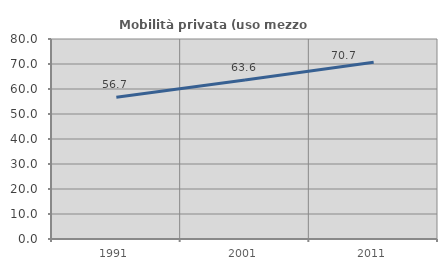
| Category | Mobilità privata (uso mezzo privato) |
|---|---|
| 1991.0 | 56.712 |
| 2001.0 | 63.636 |
| 2011.0 | 70.726 |